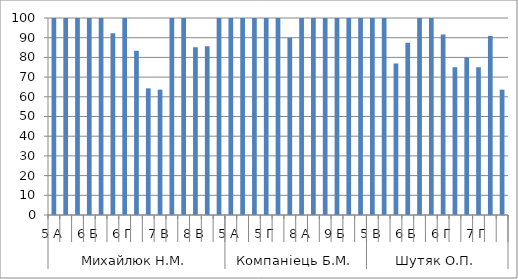
| Category | Series 0 |
|---|---|
| 0 | 100 |
| 1 | 100 |
| 2 | 100 |
| 3 | 100 |
| 4 | 100 |
| 5 | 92.308 |
| 6 | 100 |
| 7 | 83.333 |
| 8 | 64.286 |
| 9 | 63.636 |
| 10 | 100 |
| 11 | 100 |
| 12 | 85.185 |
| 13 | 85.714 |
| 14 | 100 |
| 15 | 100 |
| 16 | 100 |
| 17 | 100 |
| 18 | 100 |
| 19 | 100 |
| 20 | 90 |
| 21 | 100 |
| 22 | 100 |
| 23 | 100 |
| 24 | 100 |
| 25 | 100 |
| 26 | 100 |
| 27 | 100 |
| 28 | 100 |
| 29 | 76.923 |
| 30 | 87.5 |
| 31 | 100 |
| 32 | 100 |
| 33 | 91.667 |
| 34 | 75 |
| 35 | 80 |
| 36 | 75 |
| 37 | 90.909 |
| 38 | 63.636 |